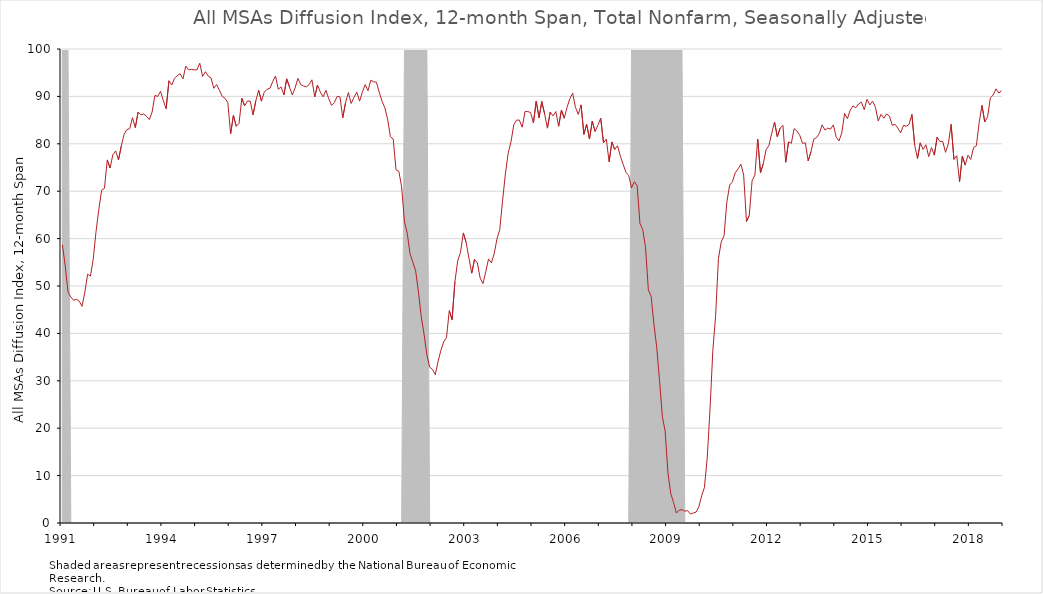
| Category | DI_12month |
|---|---|
| 1991 | 58.7 |
| 1991 | 54.3 |
| 1991 | 48.7 |
| 1991 | 47.7 |
| 1991 | 47 |
| 1991 | 47.2 |
| 1991 | 46.8 |
| 1991 | 45.7 |
| 1991 | 48.7 |
| 1991 | 52.5 |
| 1991 | 52.1 |
| 1991 | 55.7 |
| 1992 | 61.5 |
| 1992 | 66.2 |
| 1992 | 70.2 |
| 1992 | 70.6 |
| 1992 | 76.6 |
| 1992 | 74.9 |
| 1992 | 77.7 |
| 1992 | 78.5 |
| 1992 | 76.6 |
| 1992 | 79.5 |
| 1992 | 82 |
| 1992 | 83 |
| 1993 | 83.2 |
| 1993 | 85.5 |
| 1993 | 83.4 |
| 1993 | 86.7 |
| 1993 | 86.1 |
| 1993 | 86.3 |
| 1993 | 85.8 |
| 1993 | 85.1 |
| 1993 | 86.7 |
| 1993 | 90.2 |
| 1993 | 90 |
| 1993 | 91.1 |
| 1994 | 89.1 |
| 1994 | 87.4 |
| 1994 | 93.3 |
| 1994 | 92.4 |
| 1994 | 93.8 |
| 1994 | 94.4 |
| 1994 | 94.8 |
| 1994 | 93.7 |
| 1994 | 96.4 |
| 1994 | 95.6 |
| 1994 | 95.7 |
| 1994 | 95.6 |
| 1995 | 95.6 |
| 1995 | 97 |
| 1995 | 94.2 |
| 1995 | 95.2 |
| 1995 | 94.3 |
| 1995 | 93.9 |
| 1995 | 91.7 |
| 1995 | 92.5 |
| 1995 | 91.3 |
| 1995 | 90 |
| 1995 | 89.6 |
| 1995 | 88.7 |
| 1996 | 82.1 |
| 1996 | 86 |
| 1996 | 83.7 |
| 1996 | 84.3 |
| 1996 | 89.6 |
| 1996 | 88 |
| 1996 | 89 |
| 1996 | 89 |
| 1996 | 86.1 |
| 1996 | 89.1 |
| 1996 | 91.3 |
| 1996 | 89 |
| 1997 | 90.9 |
| 1997 | 91.5 |
| 1997 | 91.7 |
| 1997 | 93.1 |
| 1997 | 94.3 |
| 1997 | 91.5 |
| 1997 | 92 |
| 1997 | 90.3 |
| 1997 | 93.7 |
| 1997 | 92 |
| 1997 | 90.3 |
| 1997 | 91.8 |
| 1998 | 93.8 |
| 1998 | 92.5 |
| 1998 | 92.2 |
| 1998 | 92 |
| 1998 | 92.5 |
| 1998 | 93.5 |
| 1998 | 89.9 |
| 1998 | 92.4 |
| 1998 | 90.9 |
| 1998 | 89.9 |
| 1998 | 91.3 |
| 1998 | 89.5 |
| 1999 | 88.1 |
| 1999 | 88.7 |
| 1999 | 90 |
| 1999 | 89.9 |
| 1999 | 85.5 |
| 1999 | 88.7 |
| 1999 | 90.8 |
| 1999 | 88.5 |
| 1999 | 89.8 |
| 1999 | 90.9 |
| 1999 | 89 |
| 1999 | 90.9 |
| 2000 | 92.5 |
| 2000 | 91.2 |
| 2000 | 93.4 |
| 2000 | 93.1 |
| 2000 | 93 |
| 2000 | 90.9 |
| 2000 | 89 |
| 2000 | 87.6 |
| 2000 | 85.2 |
| 2000 | 81.5 |
| 2000 | 81 |
| 2000 | 74.5 |
| 2001 | 74.2 |
| 2001 | 70.9 |
| 2001 | 63.6 |
| 2001 | 61.1 |
| 2001 | 56.8 |
| 2001 | 55 |
| 2001 | 53.2 |
| 2001 | 48.7 |
| 2001 | 43.5 |
| 2001 | 39.8 |
| 2001 | 35.5 |
| 2001 | 32.9 |
| 2002 | 32.4 |
| 2002 | 31.3 |
| 2002 | 34.1 |
| 2002 | 36.4 |
| 2002 | 38.2 |
| 2002 | 39.1 |
| 2002 | 44.8 |
| 2002 | 42.9 |
| 2002 | 50.9 |
| 2002 | 55.3 |
| 2002 | 57.1 |
| 2002 | 61.2 |
| 2003 | 59.2 |
| 2003 | 55.9 |
| 2003 | 52.7 |
| 2003 | 55.6 |
| 2003 | 54.9 |
| 2003 | 51.7 |
| 2003 | 50.5 |
| 2003 | 53 |
| 2003 | 55.7 |
| 2003 | 54.9 |
| 2003 | 56.8 |
| 2003 | 59.9 |
| 2004 | 61.9 |
| 2004 | 68 |
| 2004 | 73.6 |
| 2004 | 78 |
| 2004 | 80.4 |
| 2004 | 84 |
| 2004 | 85 |
| 2004 | 85 |
| 2004 | 83.5 |
| 2004 | 86.8 |
| 2004 | 86.8 |
| 2004 | 86.6 |
| 2005 | 84.4 |
| 2005 | 89 |
| 2005 | 85.5 |
| 2005 | 88.9 |
| 2005 | 86.3 |
| 2005 | 83.3 |
| 2005 | 86.7 |
| 2005 | 85.9 |
| 2005 | 86.8 |
| 2005 | 83.7 |
| 2005 | 87.1 |
| 2005 | 85.4 |
| 2006 | 87.7 |
| 2006 | 89.5 |
| 2006 | 90.7 |
| 2006 | 87.7 |
| 2006 | 86.2 |
| 2006 | 88.2 |
| 2006 | 82 |
| 2006 | 84.1 |
| 2006 | 81 |
| 2006 | 84.8 |
| 2006 | 82.6 |
| 2006 | 83.9 |
| 2007 | 85.4 |
| 2007 | 80.2 |
| 2007 | 81 |
| 2007 | 76.2 |
| 2007 | 80.4 |
| 2007 | 78.8 |
| 2007 | 79.6 |
| 2007 | 77.4 |
| 2007 | 75.7 |
| 2007 | 74 |
| 2007 | 73.3 |
| 2007 | 70.7 |
| 2008 | 72 |
| 2008 | 71.2 |
| 2008 | 63.2 |
| 2008 | 61.9 |
| 2008 | 58.1 |
| 2008 | 49.2 |
| 2008 | 47.8 |
| 2008 | 41.9 |
| 2008 | 37 |
| 2008 | 30 |
| 2008 | 22.4 |
| 2008 | 19.4 |
| 2009 | 10.5 |
| 2009 | 6.2 |
| 2009 | 4.3 |
| 2009 | 2.1 |
| 2009 | 2.7 |
| 2009 | 2.8 |
| 2009 | 2.5 |
| 2009 | 2.6 |
| 2009 | 1.9 |
| 2009 | 2.1 |
| 2009 | 2.3 |
| 2009 | 3.4 |
| 2010 | 5.7 |
| 2010 | 7.5 |
| 2010 | 13.7 |
| 2010 | 24 |
| 2010 | 36.4 |
| 2010 | 43.8 |
| 2010 | 55.8 |
| 2010 | 59.3 |
| 2010 | 60.6 |
| 2010 | 67.7 |
| 2010 | 71.3 |
| 2010 | 72 |
| 2011 | 73.9 |
| 2011 | 74.7 |
| 2011 | 75.7 |
| 2011 | 73.4 |
| 2011 | 63.6 |
| 2011 | 64.9 |
| 2011 | 72.2 |
| 2011 | 73.4 |
| 2011 | 81 |
| 2011 | 73.9 |
| 2011 | 75.8 |
| 2011 | 78.8 |
| 2012 | 79.6 |
| 2012 | 82.2 |
| 2012 | 84.6 |
| 2012 | 81.5 |
| 2012 | 83.3 |
| 2012 | 83.9 |
| 2012 | 76.1 |
| 2012 | 80.4 |
| 2012 | 80.1 |
| 2012 | 83.2 |
| 2012 | 82.7 |
| 2012 | 81.8 |
| 2013 | 80.1 |
| 2013 | 80.2 |
| 2013 | 76.4 |
| 2013 | 78.3 |
| 2013 | 81 |
| 2013 | 81.3 |
| 2013 | 82.2 |
| 2013 | 84 |
| 2013 | 82.9 |
| 2013 | 83.3 |
| 2013 | 83.1 |
| 2013 | 84 |
| 2014 | 81.4 |
| 2014 | 80.6 |
| 2014 | 82.3 |
| 2014 | 86.4 |
| 2014 | 85.3 |
| 2014 | 87.1 |
| 2014 | 88 |
| 2014 | 87.6 |
| 2014 | 88.4 |
| 2014 | 88.8 |
| 2014 | 87.2 |
| 2014 | 89.4 |
| 2015 | 88.2 |
| 2015 | 89 |
| 2015 | 87.7 |
| 2015 | 84.8 |
| 2015 | 86.2 |
| 2015 | 85.4 |
| 2015 | 86.3 |
| 2015 | 85.8 |
| 2015 | 83.9 |
| 2015 | 84.1 |
| 2015 | 83.3 |
| 2015 | 82.3 |
| 2016 | 83.9 |
| 2016 | 83.7 |
| 2016 | 84.1 |
| 2016 | 86.2 |
| 2016 | 79.7 |
| 2016 | 76.9 |
| 2016 | 80.2 |
| 2016 | 78.8 |
| 2016 | 79.8 |
| 2016 | 77.3 |
| 2016 | 79.2 |
| 2016 | 77.6 |
| 2017 | 81.4 |
| 2017 | 80.5 |
| 2017 | 80.5 |
| 2017 | 78.2 |
| 2017 | 80 |
| 2017 | 84.1 |
| 2017 | 76.7 |
| 2017 | 77.5 |
| 2017 | 72 |
| 2017 | 77.4 |
| 2017 | 75.5 |
| 2017 | 77.6 |
| 2018 | 76.7 |
| 2018 | 79.2 |
| 2018 | 79.6 |
| 2018 | 84.5 |
| 2018 | 88.1 |
| 2018 | 84.6 |
| 2018 | 85.7 |
| 2018 | 89.7 |
| 2018 | 90.3 |